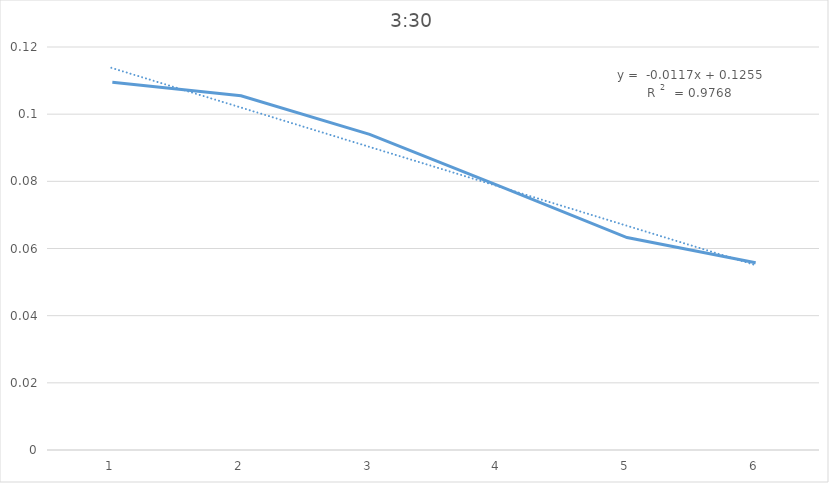
| Category | Series 0 |
|---|---|
| 0 | 0.11 |
| 1 | 0.106 |
| 2 | 0.094 |
| 3 | 0.079 |
| 4 | 0.063 |
| 5 | 0.056 |